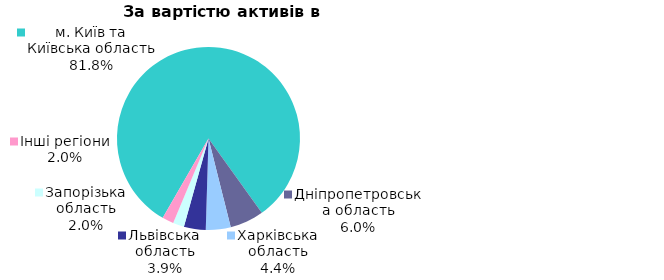
| Category | Series 0 |
|---|---|
| м. Київ та Київська область | 0.818 |
| Дніпропетровська область | 0.06 |
| Харківська область | 0.044 |
| Львівська область | 0.039 |
| Запорізька область | 0.02 |
| Інші регіони | 0.02 |